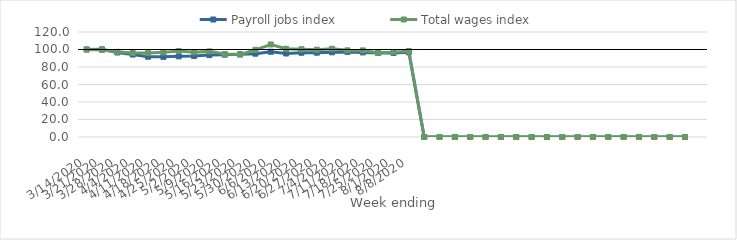
| Category | Payroll jobs index | Total wages index |
|---|---|---|
| 14/03/2020 | 100 | 100 |
| 21/03/2020 | 100.205 | 99.447 |
| 28/03/2020 | 96.551 | 97.297 |
| 04/04/2020 | 94.226 | 95.976 |
| 11/04/2020 | 91.717 | 95.891 |
| 18/04/2020 | 91.599 | 96.718 |
| 25/04/2020 | 92.169 | 98.169 |
| 02/05/2020 | 92.507 | 96.827 |
| 09/05/2020 | 93.588 | 97.849 |
| 16/05/2020 | 94.106 | 94.815 |
| 23/05/2020 | 94.57 | 94.178 |
| 30/05/2020 | 95.245 | 99.654 |
| 06/06/2020 | 97.418 | 105.76 |
| 13/06/2020 | 95.442 | 100.814 |
| 20/06/2020 | 96.316 | 100.295 |
| 27/06/2020 | 96.328 | 99.803 |
| 04/07/2020 | 96.771 | 100.809 |
| 11/07/2020 | 97.242 | 99.041 |
| 18/07/2020 | 96.642 | 98.961 |
| 25/07/2020 | 96.02 | 96.177 |
| 01/08/2020 | 96.059 | 97.002 |
| 08/08/2020 | 96.759 | 98.262 |